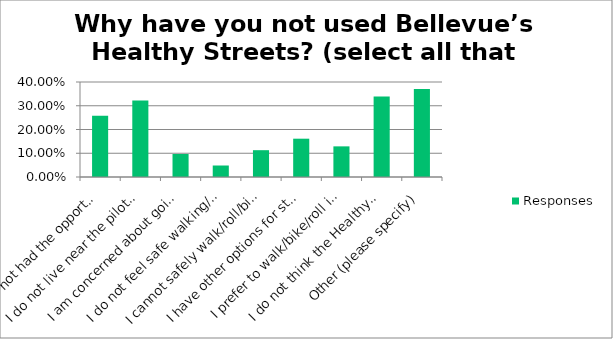
| Category | Responses |
|---|---|
| I have not had the opportunity to yet but would like to | 0.258 |
| I do not live near the pilot Healthy Streets | 0.323 |
| I am concerned about going outside during COVID-19 | 0.097 |
| I do not feel safe walking/biking/rolling in the street | 0.048 |
| I cannot safely walk/roll/bike to a Healthy Street from where I live | 0.113 |
| I have other options for staying active (such as a private yard) | 0.161 |
| I prefer to walk/bike/roll in the park | 0.129 |
| I do not think the Healthy Streets pilot is useful to me | 0.339 |
| Other (please specify) | 0.371 |